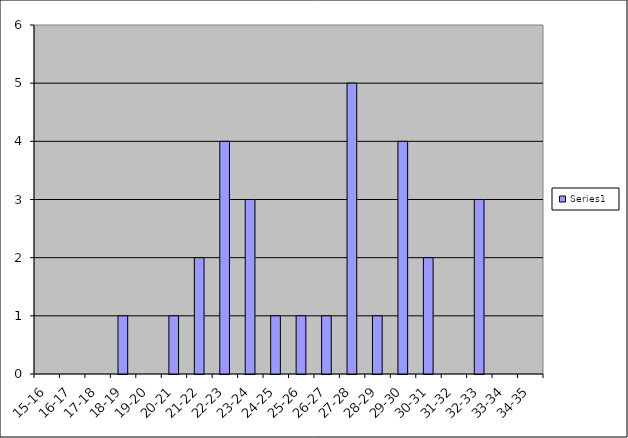
| Category | Series 0 |
|---|---|
| 15-16 | 0 |
| 16-17 | 0 |
| 17-18 | 0 |
| 18-19 | 1 |
| 19-20 | 0 |
| 20-21 | 1 |
| 21-22 | 2 |
| 22-23 | 4 |
| 23-24 | 3 |
| 24-25 | 1 |
| 25-26 | 1 |
| 26-27 | 1 |
| 27-28 | 5 |
| 28-29 | 1 |
| 29-30 | 4 |
| 30-31 | 2 |
| 31-32 | 0 |
| 32-33 | 3 |
| 33-34 | 0 |
| 34-35 | 0 |